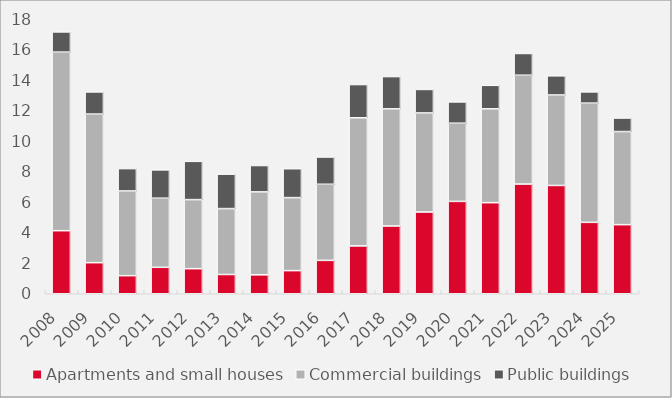
| Category | Apartments and small houses | Commercial buildings | Public buildings |
|---|---|---|---|
| 2008.0 | 4.128 | 11.688 | 1.323 |
| 2009.0 | 2.035 | 9.726 | 1.45 |
| 2010.0 | 1.184 | 5.544 | 1.465 |
| 2011.0 | 1.73 | 4.525 | 1.853 |
| 2012.0 | 1.642 | 4.52 | 2.505 |
| 2013.0 | 1.26 | 4.314 | 2.254 |
| 2014.0 | 1.24 | 5.428 | 1.725 |
| 2015.0 | 1.515 | 4.777 | 1.892 |
| 2016.0 | 2.186 | 4.98 | 1.786 |
| 2017.0 | 3.133 | 8.385 | 2.175 |
| 2018.0 | 4.437 | 7.666 | 2.113 |
| 2019.0 | 5.351 | 6.483 | 1.54 |
| 2020.0 | 6.046 | 5.117 | 1.393 |
| 2021.0 | 5.962 | 6.142 | 1.538 |
| 2022.0 | 7.182 | 7.122 | 1.423 |
| 2023.0 | 7.089 | 5.921 | 1.255 |
| 2024.0 | 4.674 | 7.803 | 0.737 |
| 2025.0 | 4.523 | 6.093 | 0.888 |